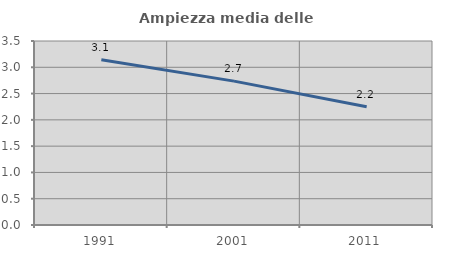
| Category | Ampiezza media delle famiglie |
|---|---|
| 1991.0 | 3.142 |
| 2001.0 | 2.737 |
| 2011.0 | 2.249 |